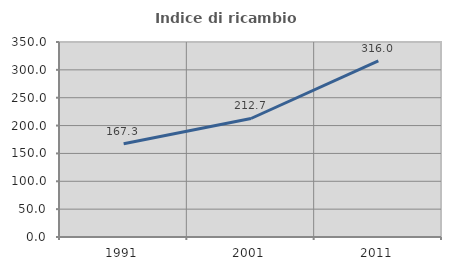
| Category | Indice di ricambio occupazionale  |
|---|---|
| 1991.0 | 167.337 |
| 2001.0 | 212.693 |
| 2011.0 | 315.985 |